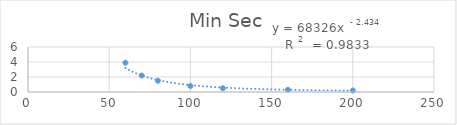
| Category | Min Sec |
|---|---|
| 60.0 | 3.9 |
| 70.0 | 2.2 |
| 80.0 | 1.5 |
| 100.0 | 0.8 |
| 120.0 | 0.5 |
| 160.0 | 0.3 |
| 200.0 | 0.2 |